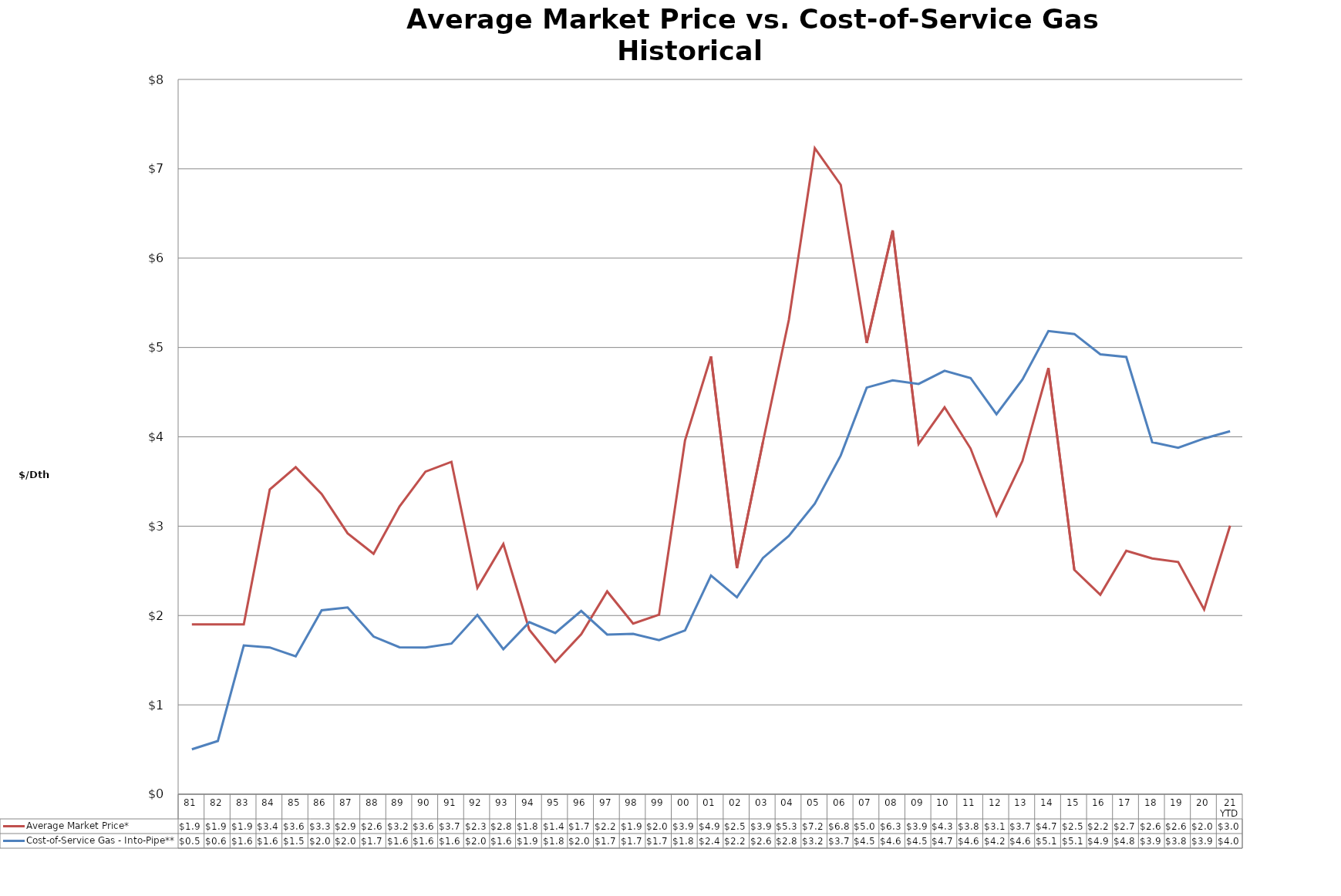
| Category | Average Market Price* | Cost-of-Service Gas - Into-Pipe** |
|---|---|---|
| 81 | 1.9 | 0.502 |
| 82 | 1.9 | 0.596 |
| 83 | 1.9 | 1.665 |
| 84 | 3.41 | 1.643 |
| 85 | 3.66 | 1.543 |
| 86 | 3.36 | 2.059 |
| 87 | 2.92 | 2.091 |
| 88 | 2.69 | 1.764 |
| 89 | 3.22 | 1.644 |
| 90 | 3.61 | 1.642 |
| 91 | 3.72 | 1.685 |
| 92 | 2.31 | 2.005 |
| 93 | 2.8 | 1.623 |
| 94 | 1.84 | 1.926 |
| 95 | 1.48 | 1.804 |
| 96 | 1.79 | 2.052 |
| 97 | 2.27 | 1.787 |
| 98 | 1.91 | 1.795 |
| 99 | 2.01 | 1.725 |
| 00 | 3.96 | 1.833 |
| 01 | 4.9 | 2.448 |
| 02 | 2.53 | 2.204 |
| 03 | 3.94 | 2.644 |
| 04 | 5.31 | 2.891 |
| 05 | 7.23 | 3.251 |
| 06 | 6.82 | 3.792 |
| 07 | 5.05 | 4.551 |
| 08 | 6.31 | 4.632 |
| 09 | 3.92 | 4.592 |
| 10 | 4.33 | 4.74 |
| 11 | 3.87 | 4.658 |
| 12 | 3.12 | 4.253 |
| 13 | 3.73 | 4.641 |
| 14 | 4.77 | 5.184 |
| 15 | 2.51 | 5.151 |
| 16 | 2.233 | 4.923 |
| 17 | 2.725 | 4.894 |
| 18 | 2.639 | 3.94 |
| 19 | 2.599 | 3.877 |
| 20 | 2.067 | 3.981 |
| 21 YTD | 3.006 | 4.062 |